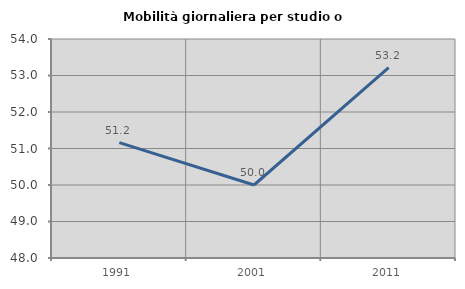
| Category | Mobilità giornaliera per studio o lavoro |
|---|---|
| 1991.0 | 51.163 |
| 2001.0 | 50 |
| 2011.0 | 53.219 |